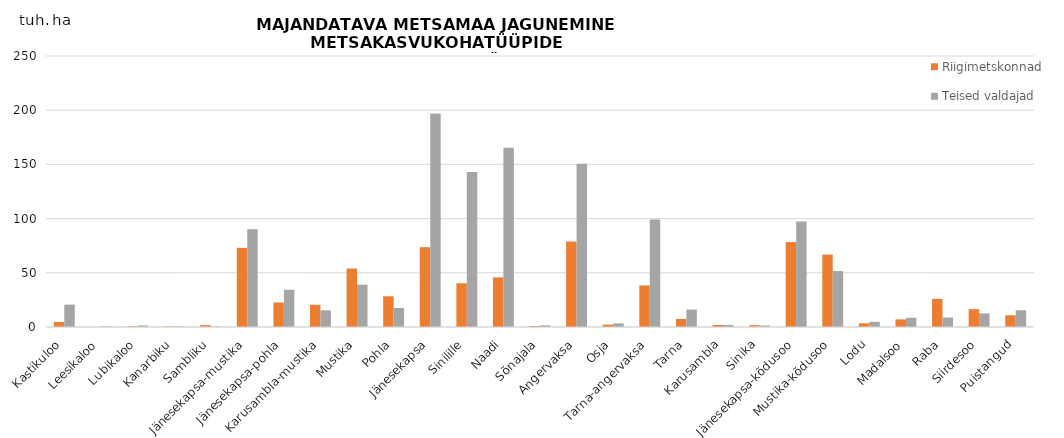
| Category | Riigimetskonnad | Teised valdajad |
|---|---|---|
| 0 | 4.677 | 20.645 |
| 1 | 0 | 0.779 |
| 2 | 0.682 | 1.369 |
| 3 | 0.419 | 0.716 |
| 4 | 1.715 | 0.44 |
| 5 | 73.033 | 90.281 |
| 6 | 22.581 | 34.336 |
| 7 | 20.509 | 15.389 |
| 8 | 53.92 | 39.073 |
| 9 | 28.335 | 17.595 |
| 10 | 73.61 | 197.035 |
| 11 | 40.296 | 142.983 |
| 12 | 45.808 | 165.279 |
| 13 | 0.935 | 1.497 |
| 14 | 78.956 | 150.603 |
| 15 | 2.182 | 3.323 |
| 16 | 38.305 | 99.11 |
| 17 | 7.415 | 16.074 |
| 18 | 1.886 | 1.871 |
| 19 | 1.668 | 1.403 |
| 20 | 78.279 | 97.426 |
| 21 | 66.784 | 51.554 |
| 22 | 3.424 | 4.766 |
| 23 | 7.015 | 8.561 |
| 24 | 25.979 | 8.744 |
| 25 | 16.457 | 12.565 |
| 26 | 10.828 | 15.454 |